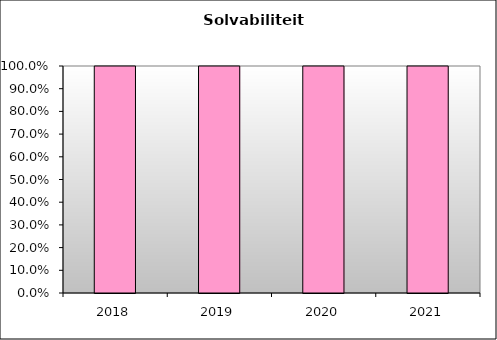
| Category | Series 0 |
|---|---|
| 2018.0 | 1 |
| 2019.0 | 1 |
| 2020.0 | 1 |
| 2021.0 | 1 |